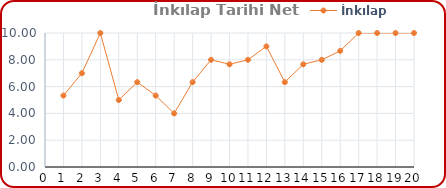
| Category | İnkılap Tarihi |
|---|---|
| 0 | 5.333 |
| 1 | 7 |
| 2 | 10 |
| 3 | 5 |
| 4 | 6.333 |
| 5 | 5.333 |
| 6 | 4 |
| 7 | 6.333 |
| 8 | 8 |
| 9 | 7.667 |
| 10 | 8 |
| 11 | 9 |
| 12 | 6.333 |
| 13 | 7.667 |
| 14 | 8 |
| 15 | 8.667 |
| 16 | 10 |
| 17 | 10 |
| 18 | 10 |
| 19 | 10 |